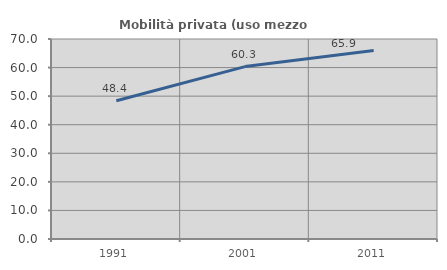
| Category | Mobilità privata (uso mezzo privato) |
|---|---|
| 1991.0 | 48.365 |
| 2001.0 | 60.338 |
| 2011.0 | 65.939 |